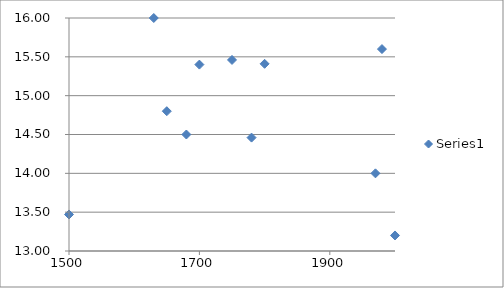
| Category | Series 0 |
|---|---|
| 1500.0 | 13.47 |
| 1630.0 | 16 |
| 1650.0 | 14.8 |
| 1680.0 | 14.5 |
| 1700.0 | 15.4 |
| 1750.0 | 15.46 |
| 1780.0 | 14.46 |
| 1800.0 | 15.41 |
| 1970.0 | 14 |
| 1980.0 | 15.6 |
| 2000.0 | 13.2 |